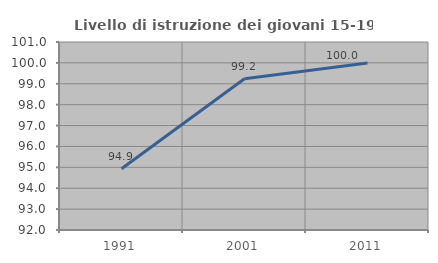
| Category | Livello di istruzione dei giovani 15-19 anni |
|---|---|
| 1991.0 | 94.931 |
| 2001.0 | 99.242 |
| 2011.0 | 100 |